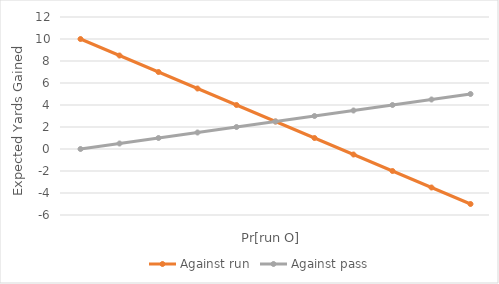
| Category | Against run | Against pass |
|---|---|---|
| 0 | 10 | 0 |
| 1 | 8.5 | 0.5 |
| 2 | 7 | 1 |
| 3 | 5.5 | 1.5 |
| 4 | 4 | 2 |
| 5 | 2.5 | 2.5 |
| 6 | 1 | 3 |
| 7 | -0.5 | 3.5 |
| 8 | -2 | 4 |
| 9 | -3.5 | 4.5 |
| 10 | -5 | 5 |